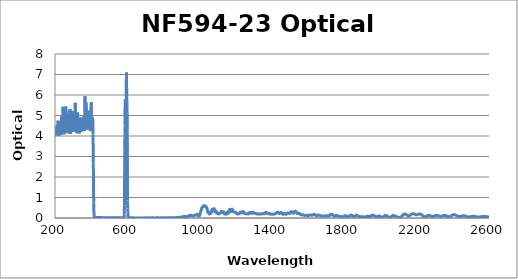
| Category | Optical Density |
|---|---|
| 2600.0 | 0.053 |
| 2599.0 | 0.053 |
| 2598.0 | 0.053 |
| 2597.0 | 0.053 |
| 2596.0 | 0.054 |
| 2595.0 | 0.054 |
| 2594.0 | 0.055 |
| 2593.0 | 0.055 |
| 2592.0 | 0.056 |
| 2591.0 | 0.057 |
| 2590.0 | 0.058 |
| 2589.0 | 0.058 |
| 2588.0 | 0.059 |
| 2587.0 | 0.06 |
| 2586.0 | 0.062 |
| 2585.0 | 0.063 |
| 2584.0 | 0.064 |
| 2583.0 | 0.065 |
| 2582.0 | 0.066 |
| 2581.0 | 0.067 |
| 2580.0 | 0.068 |
| 2579.0 | 0.069 |
| 2578.0 | 0.069 |
| 2577.0 | 0.07 |
| 2576.0 | 0.071 |
| 2575.0 | 0.072 |
| 2574.0 | 0.072 |
| 2573.0 | 0.073 |
| 2572.0 | 0.073 |
| 2571.0 | 0.073 |
| 2570.0 | 0.073 |
| 2569.0 | 0.073 |
| 2568.0 | 0.073 |
| 2567.0 | 0.072 |
| 2566.0 | 0.072 |
| 2565.0 | 0.071 |
| 2564.0 | 0.07 |
| 2563.0 | 0.069 |
| 2562.0 | 0.068 |
| 2561.0 | 0.067 |
| 2560.0 | 0.066 |
| 2559.0 | 0.064 |
| 2558.0 | 0.063 |
| 2557.0 | 0.062 |
| 2556.0 | 0.061 |
| 2555.0 | 0.059 |
| 2554.0 | 0.058 |
| 2553.0 | 0.056 |
| 2552.0 | 0.055 |
| 2551.0 | 0.053 |
| 2550.0 | 0.052 |
| 2549.0 | 0.05 |
| 2548.0 | 0.049 |
| 2547.0 | 0.048 |
| 2546.0 | 0.047 |
| 2545.0 | 0.046 |
| 2544.0 | 0.045 |
| 2543.0 | 0.045 |
| 2542.0 | 0.045 |
| 2541.0 | 0.045 |
| 2540.0 | 0.045 |
| 2539.0 | 0.046 |
| 2538.0 | 0.046 |
| 2537.0 | 0.047 |
| 2536.0 | 0.048 |
| 2535.0 | 0.05 |
| 2534.0 | 0.051 |
| 2533.0 | 0.053 |
| 2532.0 | 0.055 |
| 2531.0 | 0.056 |
| 2530.0 | 0.059 |
| 2529.0 | 0.061 |
| 2528.0 | 0.062 |
| 2527.0 | 0.064 |
| 2526.0 | 0.066 |
| 2525.0 | 0.069 |
| 2524.0 | 0.071 |
| 2523.0 | 0.073 |
| 2522.0 | 0.074 |
| 2521.0 | 0.076 |
| 2520.0 | 0.078 |
| 2519.0 | 0.08 |
| 2518.0 | 0.081 |
| 2517.0 | 0.082 |
| 2516.0 | 0.083 |
| 2515.0 | 0.084 |
| 2514.0 | 0.085 |
| 2513.0 | 0.085 |
| 2512.0 | 0.085 |
| 2511.0 | 0.085 |
| 2510.0 | 0.084 |
| 2509.0 | 0.084 |
| 2508.0 | 0.083 |
| 2507.0 | 0.082 |
| 2506.0 | 0.081 |
| 2505.0 | 0.079 |
| 2504.0 | 0.077 |
| 2503.0 | 0.075 |
| 2502.0 | 0.074 |
| 2501.0 | 0.072 |
| 2500.0 | 0.07 |
| 2499.0 | 0.068 |
| 2498.0 | 0.066 |
| 2497.0 | 0.064 |
| 2496.0 | 0.062 |
| 2495.0 | 0.06 |
| 2494.0 | 0.058 |
| 2493.0 | 0.057 |
| 2492.0 | 0.056 |
| 2491.0 | 0.055 |
| 2490.0 | 0.054 |
| 2489.0 | 0.053 |
| 2488.0 | 0.053 |
| 2487.0 | 0.053 |
| 2486.0 | 0.054 |
| 2485.0 | 0.055 |
| 2484.0 | 0.055 |
| 2483.0 | 0.057 |
| 2482.0 | 0.058 |
| 2481.0 | 0.06 |
| 2480.0 | 0.062 |
| 2479.0 | 0.065 |
| 2478.0 | 0.067 |
| 2477.0 | 0.07 |
| 2476.0 | 0.073 |
| 2475.0 | 0.076 |
| 2474.0 | 0.08 |
| 2473.0 | 0.083 |
| 2472.0 | 0.086 |
| 2471.0 | 0.09 |
| 2470.0 | 0.093 |
| 2469.0 | 0.096 |
| 2468.0 | 0.099 |
| 2467.0 | 0.101 |
| 2466.0 | 0.103 |
| 2465.0 | 0.105 |
| 2464.0 | 0.107 |
| 2463.0 | 0.109 |
| 2462.0 | 0.11 |
| 2461.0 | 0.111 |
| 2460.0 | 0.112 |
| 2459.0 | 0.112 |
| 2458.0 | 0.111 |
| 2457.0 | 0.111 |
| 2456.0 | 0.11 |
| 2455.0 | 0.109 |
| 2454.0 | 0.107 |
| 2453.0 | 0.106 |
| 2452.0 | 0.104 |
| 2451.0 | 0.101 |
| 2450.0 | 0.099 |
| 2449.0 | 0.096 |
| 2448.0 | 0.093 |
| 2447.0 | 0.091 |
| 2446.0 | 0.088 |
| 2445.0 | 0.085 |
| 2444.0 | 0.082 |
| 2443.0 | 0.08 |
| 2442.0 | 0.077 |
| 2441.0 | 0.075 |
| 2440.0 | 0.073 |
| 2439.0 | 0.072 |
| 2438.0 | 0.07 |
| 2437.0 | 0.07 |
| 2436.0 | 0.069 |
| 2435.0 | 0.07 |
| 2434.0 | 0.07 |
| 2433.0 | 0.071 |
| 2432.0 | 0.073 |
| 2431.0 | 0.075 |
| 2430.0 | 0.078 |
| 2429.0 | 0.081 |
| 2428.0 | 0.084 |
| 2427.0 | 0.088 |
| 2426.0 | 0.092 |
| 2425.0 | 0.097 |
| 2424.0 | 0.101 |
| 2423.0 | 0.106 |
| 2422.0 | 0.111 |
| 2421.0 | 0.116 |
| 2420.0 | 0.121 |
| 2419.0 | 0.126 |
| 2418.0 | 0.131 |
| 2417.0 | 0.136 |
| 2416.0 | 0.14 |
| 2415.0 | 0.144 |
| 2414.0 | 0.148 |
| 2413.0 | 0.151 |
| 2412.0 | 0.154 |
| 2411.0 | 0.156 |
| 2410.0 | 0.158 |
| 2409.0 | 0.159 |
| 2408.0 | 0.16 |
| 2407.0 | 0.16 |
| 2406.0 | 0.16 |
| 2405.0 | 0.16 |
| 2404.0 | 0.158 |
| 2403.0 | 0.157 |
| 2402.0 | 0.154 |
| 2401.0 | 0.151 |
| 2400.0 | 0.148 |
| 2399.0 | 0.144 |
| 2398.0 | 0.139 |
| 2397.0 | 0.135 |
| 2396.0 | 0.13 |
| 2395.0 | 0.124 |
| 2394.0 | 0.118 |
| 2393.0 | 0.112 |
| 2392.0 | 0.107 |
| 2391.0 | 0.101 |
| 2390.0 | 0.095 |
| 2389.0 | 0.09 |
| 2388.0 | 0.084 |
| 2387.0 | 0.079 |
| 2386.0 | 0.074 |
| 2385.0 | 0.07 |
| 2384.0 | 0.066 |
| 2383.0 | 0.063 |
| 2382.0 | 0.06 |
| 2381.0 | 0.058 |
| 2380.0 | 0.057 |
| 2379.0 | 0.057 |
| 2378.0 | 0.057 |
| 2377.0 | 0.058 |
| 2376.0 | 0.059 |
| 2375.0 | 0.061 |
| 2374.0 | 0.063 |
| 2373.0 | 0.067 |
| 2372.0 | 0.07 |
| 2371.0 | 0.074 |
| 2370.0 | 0.078 |
| 2369.0 | 0.082 |
| 2368.0 | 0.086 |
| 2367.0 | 0.091 |
| 2366.0 | 0.095 |
| 2365.0 | 0.099 |
| 2364.0 | 0.104 |
| 2363.0 | 0.108 |
| 2362.0 | 0.112 |
| 2361.0 | 0.115 |
| 2360.0 | 0.118 |
| 2359.0 | 0.121 |
| 2358.0 | 0.123 |
| 2357.0 | 0.125 |
| 2356.0 | 0.127 |
| 2355.0 | 0.128 |
| 2354.0 | 0.128 |
| 2353.0 | 0.128 |
| 2352.0 | 0.127 |
| 2351.0 | 0.126 |
| 2350.0 | 0.125 |
| 2349.0 | 0.123 |
| 2348.0 | 0.121 |
| 2347.0 | 0.118 |
| 2346.0 | 0.115 |
| 2345.0 | 0.112 |
| 2344.0 | 0.109 |
| 2343.0 | 0.106 |
| 2342.0 | 0.102 |
| 2341.0 | 0.099 |
| 2340.0 | 0.096 |
| 2339.0 | 0.093 |
| 2338.0 | 0.091 |
| 2337.0 | 0.088 |
| 2336.0 | 0.086 |
| 2335.0 | 0.085 |
| 2334.0 | 0.084 |
| 2333.0 | 0.083 |
| 2332.0 | 0.083 |
| 2331.0 | 0.083 |
| 2330.0 | 0.084 |
| 2329.0 | 0.085 |
| 2328.0 | 0.086 |
| 2327.0 | 0.088 |
| 2326.0 | 0.091 |
| 2325.0 | 0.093 |
| 2324.0 | 0.096 |
| 2323.0 | 0.099 |
| 2322.0 | 0.102 |
| 2321.0 | 0.106 |
| 2320.0 | 0.109 |
| 2319.0 | 0.112 |
| 2318.0 | 0.115 |
| 2317.0 | 0.118 |
| 2316.0 | 0.121 |
| 2315.0 | 0.123 |
| 2314.0 | 0.125 |
| 2313.0 | 0.126 |
| 2312.0 | 0.127 |
| 2311.0 | 0.128 |
| 2310.0 | 0.128 |
| 2309.0 | 0.128 |
| 2308.0 | 0.127 |
| 2307.0 | 0.125 |
| 2306.0 | 0.123 |
| 2305.0 | 0.121 |
| 2304.0 | 0.118 |
| 2303.0 | 0.115 |
| 2302.0 | 0.112 |
| 2301.0 | 0.108 |
| 2300.0 | 0.104 |
| 2299.0 | 0.101 |
| 2298.0 | 0.097 |
| 2297.0 | 0.092 |
| 2296.0 | 0.089 |
| 2295.0 | 0.085 |
| 2294.0 | 0.082 |
| 2293.0 | 0.079 |
| 2292.0 | 0.076 |
| 2291.0 | 0.074 |
| 2290.0 | 0.072 |
| 2289.0 | 0.071 |
| 2288.0 | 0.07 |
| 2287.0 | 0.07 |
| 2286.0 | 0.071 |
| 2285.0 | 0.072 |
| 2284.0 | 0.073 |
| 2283.0 | 0.076 |
| 2282.0 | 0.078 |
| 2281.0 | 0.082 |
| 2280.0 | 0.085 |
| 2279.0 | 0.089 |
| 2278.0 | 0.093 |
| 2277.0 | 0.097 |
| 2276.0 | 0.101 |
| 2275.0 | 0.105 |
| 2274.0 | 0.109 |
| 2273.0 | 0.113 |
| 2272.0 | 0.117 |
| 2271.0 | 0.12 |
| 2270.0 | 0.123 |
| 2269.0 | 0.125 |
| 2268.0 | 0.126 |
| 2267.0 | 0.127 |
| 2266.0 | 0.127 |
| 2265.0 | 0.127 |
| 2264.0 | 0.126 |
| 2263.0 | 0.124 |
| 2262.0 | 0.122 |
| 2261.0 | 0.119 |
| 2260.0 | 0.115 |
| 2259.0 | 0.112 |
| 2258.0 | 0.107 |
| 2257.0 | 0.102 |
| 2256.0 | 0.097 |
| 2255.0 | 0.092 |
| 2254.0 | 0.087 |
| 2253.0 | 0.083 |
| 2252.0 | 0.078 |
| 2251.0 | 0.073 |
| 2250.0 | 0.069 |
| 2249.0 | 0.065 |
| 2248.0 | 0.062 |
| 2247.0 | 0.059 |
| 2246.0 | 0.057 |
| 2245.0 | 0.056 |
| 2244.0 | 0.056 |
| 2243.0 | 0.057 |
| 2242.0 | 0.059 |
| 2241.0 | 0.062 |
| 2240.0 | 0.066 |
| 2239.0 | 0.071 |
| 2238.0 | 0.077 |
| 2237.0 | 0.083 |
| 2236.0 | 0.09 |
| 2235.0 | 0.098 |
| 2234.0 | 0.106 |
| 2233.0 | 0.114 |
| 2232.0 | 0.123 |
| 2231.0 | 0.131 |
| 2230.0 | 0.14 |
| 2229.0 | 0.147 |
| 2228.0 | 0.155 |
| 2227.0 | 0.162 |
| 2226.0 | 0.169 |
| 2225.0 | 0.175 |
| 2224.0 | 0.181 |
| 2223.0 | 0.186 |
| 2222.0 | 0.19 |
| 2221.0 | 0.193 |
| 2220.0 | 0.196 |
| 2219.0 | 0.197 |
| 2218.0 | 0.198 |
| 2217.0 | 0.199 |
| 2216.0 | 0.198 |
| 2215.0 | 0.197 |
| 2214.0 | 0.195 |
| 2213.0 | 0.194 |
| 2212.0 | 0.191 |
| 2211.0 | 0.189 |
| 2210.0 | 0.185 |
| 2209.0 | 0.182 |
| 2208.0 | 0.179 |
| 2207.0 | 0.175 |
| 2206.0 | 0.172 |
| 2205.0 | 0.169 |
| 2204.0 | 0.166 |
| 2203.0 | 0.163 |
| 2202.0 | 0.161 |
| 2201.0 | 0.16 |
| 2200.0 | 0.159 |
| 2199.0 | 0.159 |
| 2198.0 | 0.159 |
| 2197.0 | 0.16 |
| 2196.0 | 0.162 |
| 2195.0 | 0.164 |
| 2194.0 | 0.166 |
| 2193.0 | 0.17 |
| 2192.0 | 0.174 |
| 2191.0 | 0.177 |
| 2190.0 | 0.181 |
| 2189.0 | 0.186 |
| 2188.0 | 0.19 |
| 2187.0 | 0.194 |
| 2186.0 | 0.197 |
| 2185.0 | 0.201 |
| 2184.0 | 0.204 |
| 2183.0 | 0.206 |
| 2182.0 | 0.208 |
| 2181.0 | 0.209 |
| 2180.0 | 0.21 |
| 2179.0 | 0.21 |
| 2178.0 | 0.209 |
| 2177.0 | 0.207 |
| 2176.0 | 0.205 |
| 2175.0 | 0.202 |
| 2174.0 | 0.198 |
| 2173.0 | 0.193 |
| 2172.0 | 0.188 |
| 2171.0 | 0.182 |
| 2170.0 | 0.176 |
| 2169.0 | 0.17 |
| 2168.0 | 0.162 |
| 2167.0 | 0.155 |
| 2166.0 | 0.148 |
| 2165.0 | 0.141 |
| 2164.0 | 0.134 |
| 2163.0 | 0.127 |
| 2162.0 | 0.121 |
| 2161.0 | 0.115 |
| 2160.0 | 0.11 |
| 2159.0 | 0.106 |
| 2158.0 | 0.103 |
| 2157.0 | 0.101 |
| 2156.0 | 0.1 |
| 2155.0 | 0.1 |
| 2154.0 | 0.102 |
| 2153.0 | 0.104 |
| 2152.0 | 0.108 |
| 2151.0 | 0.112 |
| 2150.0 | 0.117 |
| 2149.0 | 0.123 |
| 2148.0 | 0.129 |
| 2147.0 | 0.136 |
| 2146.0 | 0.143 |
| 2145.0 | 0.15 |
| 2144.0 | 0.156 |
| 2143.0 | 0.163 |
| 2142.0 | 0.169 |
| 2141.0 | 0.174 |
| 2140.0 | 0.179 |
| 2139.0 | 0.183 |
| 2138.0 | 0.186 |
| 2137.0 | 0.189 |
| 2136.0 | 0.19 |
| 2135.0 | 0.191 |
| 2134.0 | 0.191 |
| 2133.0 | 0.19 |
| 2132.0 | 0.188 |
| 2131.0 | 0.185 |
| 2130.0 | 0.182 |
| 2129.0 | 0.177 |
| 2128.0 | 0.172 |
| 2127.0 | 0.166 |
| 2126.0 | 0.159 |
| 2125.0 | 0.152 |
| 2124.0 | 0.144 |
| 2123.0 | 0.136 |
| 2122.0 | 0.127 |
| 2121.0 | 0.118 |
| 2120.0 | 0.109 |
| 2119.0 | 0.1 |
| 2118.0 | 0.09 |
| 2117.0 | 0.081 |
| 2116.0 | 0.073 |
| 2115.0 | 0.064 |
| 2114.0 | 0.056 |
| 2113.0 | 0.049 |
| 2112.0 | 0.043 |
| 2111.0 | 0.037 |
| 2110.0 | 0.032 |
| 2109.0 | 0.028 |
| 2108.0 | 0.025 |
| 2107.0 | 0.022 |
| 2106.0 | 0.021 |
| 2105.0 | 0.02 |
| 2104.0 | 0.019 |
| 2103.0 | 0.019 |
| 2102.0 | 0.02 |
| 2101.0 | 0.021 |
| 2100.0 | 0.023 |
| 2099.0 | 0.025 |
| 2098.0 | 0.028 |
| 2097.0 | 0.03 |
| 2096.0 | 0.033 |
| 2095.0 | 0.037 |
| 2094.0 | 0.04 |
| 2093.0 | 0.044 |
| 2092.0 | 0.047 |
| 2091.0 | 0.051 |
| 2090.0 | 0.055 |
| 2089.0 | 0.059 |
| 2088.0 | 0.064 |
| 2087.0 | 0.068 |
| 2086.0 | 0.072 |
| 2085.0 | 0.077 |
| 2084.0 | 0.081 |
| 2083.0 | 0.086 |
| 2082.0 | 0.09 |
| 2081.0 | 0.094 |
| 2080.0 | 0.099 |
| 2079.0 | 0.102 |
| 2078.0 | 0.106 |
| 2077.0 | 0.11 |
| 2076.0 | 0.112 |
| 2075.0 | 0.115 |
| 2074.0 | 0.117 |
| 2073.0 | 0.118 |
| 2072.0 | 0.119 |
| 2071.0 | 0.119 |
| 2070.0 | 0.118 |
| 2069.0 | 0.116 |
| 2068.0 | 0.114 |
| 2067.0 | 0.111 |
| 2066.0 | 0.108 |
| 2065.0 | 0.103 |
| 2064.0 | 0.098 |
| 2063.0 | 0.093 |
| 2062.0 | 0.087 |
| 2061.0 | 0.08 |
| 2060.0 | 0.074 |
| 2059.0 | 0.067 |
| 2058.0 | 0.06 |
| 2057.0 | 0.054 |
| 2056.0 | 0.047 |
| 2055.0 | 0.041 |
| 2054.0 | 0.036 |
| 2053.0 | 0.032 |
| 2052.0 | 0.029 |
| 2051.0 | 0.026 |
| 2050.0 | 0.025 |
| 2049.0 | 0.025 |
| 2048.0 | 0.026 |
| 2047.0 | 0.029 |
| 2046.0 | 0.032 |
| 2045.0 | 0.037 |
| 2044.0 | 0.043 |
| 2043.0 | 0.049 |
| 2042.0 | 0.057 |
| 2041.0 | 0.065 |
| 2040.0 | 0.073 |
| 2039.0 | 0.081 |
| 2038.0 | 0.089 |
| 2037.0 | 0.097 |
| 2036.0 | 0.105 |
| 2035.0 | 0.111 |
| 2034.0 | 0.117 |
| 2033.0 | 0.122 |
| 2032.0 | 0.126 |
| 2031.0 | 0.129 |
| 2030.0 | 0.131 |
| 2029.0 | 0.131 |
| 2028.0 | 0.131 |
| 2027.0 | 0.129 |
| 2026.0 | 0.126 |
| 2025.0 | 0.121 |
| 2024.0 | 0.116 |
| 2023.0 | 0.11 |
| 2022.0 | 0.103 |
| 2021.0 | 0.095 |
| 2020.0 | 0.088 |
| 2019.0 | 0.079 |
| 2018.0 | 0.071 |
| 2017.0 | 0.063 |
| 2016.0 | 0.056 |
| 2015.0 | 0.049 |
| 2014.0 | 0.042 |
| 2013.0 | 0.037 |
| 2012.0 | 0.033 |
| 2011.0 | 0.03 |
| 2010.0 | 0.029 |
| 2009.0 | 0.028 |
| 2008.0 | 0.029 |
| 2007.0 | 0.032 |
| 2006.0 | 0.035 |
| 2005.0 | 0.04 |
| 2004.0 | 0.045 |
| 2003.0 | 0.051 |
| 2002.0 | 0.058 |
| 2001.0 | 0.065 |
| 2000.0 | 0.071 |
| 1999.0 | 0.078 |
| 1998.0 | 0.084 |
| 1997.0 | 0.089 |
| 1996.0 | 0.094 |
| 1995.0 | 0.098 |
| 1994.0 | 0.101 |
| 1993.0 | 0.103 |
| 1992.0 | 0.103 |
| 1991.0 | 0.103 |
| 1990.0 | 0.102 |
| 1989.0 | 0.1 |
| 1988.0 | 0.097 |
| 1987.0 | 0.093 |
| 1986.0 | 0.088 |
| 1985.0 | 0.083 |
| 1984.0 | 0.078 |
| 1983.0 | 0.073 |
| 1982.0 | 0.068 |
| 1981.0 | 0.064 |
| 1980.0 | 0.06 |
| 1979.0 | 0.057 |
| 1978.0 | 0.055 |
| 1977.0 | 0.053 |
| 1976.0 | 0.053 |
| 1975.0 | 0.054 |
| 1974.0 | 0.056 |
| 1973.0 | 0.059 |
| 1972.0 | 0.064 |
| 1971.0 | 0.069 |
| 1970.0 | 0.075 |
| 1969.0 | 0.081 |
| 1968.0 | 0.087 |
| 1967.0 | 0.095 |
| 1966.0 | 0.102 |
| 1965.0 | 0.109 |
| 1964.0 | 0.115 |
| 1963.0 | 0.121 |
| 1962.0 | 0.127 |
| 1961.0 | 0.131 |
| 1960.0 | 0.135 |
| 1959.0 | 0.138 |
| 1958.0 | 0.139 |
| 1957.0 | 0.14 |
| 1956.0 | 0.14 |
| 1955.0 | 0.139 |
| 1954.0 | 0.136 |
| 1953.0 | 0.133 |
| 1952.0 | 0.129 |
| 1951.0 | 0.125 |
| 1950.0 | 0.12 |
| 1949.0 | 0.114 |
| 1948.0 | 0.109 |
| 1947.0 | 0.104 |
| 1946.0 | 0.099 |
| 1945.0 | 0.094 |
| 1944.0 | 0.089 |
| 1943.0 | 0.085 |
| 1942.0 | 0.082 |
| 1941.0 | 0.079 |
| 1940.0 | 0.077 |
| 1939.0 | 0.076 |
| 1938.0 | 0.076 |
| 1937.0 | 0.076 |
| 1936.0 | 0.076 |
| 1935.0 | 0.077 |
| 1934.0 | 0.078 |
| 1933.0 | 0.079 |
| 1932.0 | 0.08 |
| 1931.0 | 0.081 |
| 1930.0 | 0.082 |
| 1929.0 | 0.082 |
| 1928.0 | 0.082 |
| 1927.0 | 0.082 |
| 1926.0 | 0.081 |
| 1925.0 | 0.08 |
| 1924.0 | 0.078 |
| 1923.0 | 0.076 |
| 1922.0 | 0.073 |
| 1921.0 | 0.07 |
| 1920.0 | 0.067 |
| 1919.0 | 0.063 |
| 1918.0 | 0.06 |
| 1917.0 | 0.057 |
| 1916.0 | 0.055 |
| 1915.0 | 0.053 |
| 1914.0 | 0.05 |
| 1913.0 | 0.049 |
| 1912.0 | 0.048 |
| 1911.0 | 0.048 |
| 1910.0 | 0.048 |
| 1909.0 | 0.049 |
| 1908.0 | 0.05 |
| 1907.0 | 0.052 |
| 1906.0 | 0.054 |
| 1905.0 | 0.057 |
| 1904.0 | 0.059 |
| 1903.0 | 0.061 |
| 1902.0 | 0.063 |
| 1901.0 | 0.064 |
| 1900.0 | 0.066 |
| 1899.0 | 0.067 |
| 1898.0 | 0.067 |
| 1897.0 | 0.067 |
| 1896.0 | 0.066 |
| 1895.0 | 0.065 |
| 1894.0 | 0.064 |
| 1893.0 | 0.062 |
| 1892.0 | 0.061 |
| 1891.0 | 0.059 |
| 1890.0 | 0.057 |
| 1889.0 | 0.056 |
| 1888.0 | 0.055 |
| 1887.0 | 0.054 |
| 1886.0 | 0.054 |
| 1885.0 | 0.055 |
| 1884.0 | 0.057 |
| 1883.0 | 0.06 |
| 1882.0 | 0.063 |
| 1881.0 | 0.068 |
| 1880.0 | 0.073 |
| 1879.0 | 0.078 |
| 1878.0 | 0.084 |
| 1877.0 | 0.091 |
| 1876.0 | 0.097 |
| 1875.0 | 0.104 |
| 1874.0 | 0.11 |
| 1873.0 | 0.116 |
| 1872.0 | 0.121 |
| 1871.0 | 0.126 |
| 1870.0 | 0.129 |
| 1869.0 | 0.131 |
| 1868.0 | 0.132 |
| 1867.0 | 0.131 |
| 1866.0 | 0.129 |
| 1865.0 | 0.126 |
| 1864.0 | 0.123 |
| 1863.0 | 0.118 |
| 1862.0 | 0.113 |
| 1861.0 | 0.107 |
| 1860.0 | 0.101 |
| 1859.0 | 0.095 |
| 1858.0 | 0.089 |
| 1857.0 | 0.085 |
| 1856.0 | 0.08 |
| 1855.0 | 0.076 |
| 1854.0 | 0.074 |
| 1853.0 | 0.073 |
| 1852.0 | 0.073 |
| 1851.0 | 0.074 |
| 1850.0 | 0.076 |
| 1849.0 | 0.08 |
| 1848.0 | 0.087 |
| 1847.0 | 0.094 |
| 1846.0 | 0.101 |
| 1845.0 | 0.108 |
| 1844.0 | 0.113 |
| 1843.0 | 0.119 |
| 1842.0 | 0.125 |
| 1841.0 | 0.131 |
| 1840.0 | 0.137 |
| 1839.0 | 0.141 |
| 1838.0 | 0.143 |
| 1837.0 | 0.144 |
| 1836.0 | 0.143 |
| 1835.0 | 0.141 |
| 1834.0 | 0.138 |
| 1833.0 | 0.133 |
| 1832.0 | 0.127 |
| 1831.0 | 0.121 |
| 1830.0 | 0.113 |
| 1829.0 | 0.105 |
| 1828.0 | 0.097 |
| 1827.0 | 0.089 |
| 1826.0 | 0.081 |
| 1825.0 | 0.074 |
| 1824.0 | 0.069 |
| 1823.0 | 0.064 |
| 1822.0 | 0.062 |
| 1821.0 | 0.06 |
| 1820.0 | 0.06 |
| 1819.0 | 0.062 |
| 1818.0 | 0.064 |
| 1817.0 | 0.068 |
| 1816.0 | 0.072 |
| 1815.0 | 0.077 |
| 1814.0 | 0.083 |
| 1813.0 | 0.088 |
| 1812.0 | 0.094 |
| 1811.0 | 0.099 |
| 1810.0 | 0.104 |
| 1809.0 | 0.108 |
| 1808.0 | 0.111 |
| 1807.0 | 0.112 |
| 1806.0 | 0.113 |
| 1805.0 | 0.112 |
| 1804.0 | 0.111 |
| 1803.0 | 0.109 |
| 1802.0 | 0.106 |
| 1801.0 | 0.102 |
| 1800.0 | 0.097 |
| 1799.0 | 0.092 |
| 1798.0 | 0.088 |
| 1797.0 | 0.082 |
| 1796.0 | 0.077 |
| 1795.0 | 0.073 |
| 1794.0 | 0.07 |
| 1793.0 | 0.067 |
| 1792.0 | 0.065 |
| 1791.0 | 0.063 |
| 1790.0 | 0.062 |
| 1789.0 | 0.062 |
| 1788.0 | 0.063 |
| 1787.0 | 0.064 |
| 1786.0 | 0.065 |
| 1785.0 | 0.067 |
| 1784.0 | 0.068 |
| 1783.0 | 0.07 |
| 1782.0 | 0.071 |
| 1781.0 | 0.072 |
| 1780.0 | 0.073 |
| 1779.0 | 0.073 |
| 1778.0 | 0.074 |
| 1777.0 | 0.074 |
| 1776.0 | 0.074 |
| 1775.0 | 0.075 |
| 1774.0 | 0.075 |
| 1773.0 | 0.076 |
| 1772.0 | 0.078 |
| 1771.0 | 0.079 |
| 1770.0 | 0.082 |
| 1769.0 | 0.085 |
| 1768.0 | 0.088 |
| 1767.0 | 0.092 |
| 1766.0 | 0.096 |
| 1765.0 | 0.1 |
| 1764.0 | 0.105 |
| 1763.0 | 0.109 |
| 1762.0 | 0.113 |
| 1761.0 | 0.117 |
| 1760.0 | 0.12 |
| 1759.0 | 0.122 |
| 1758.0 | 0.124 |
| 1757.0 | 0.124 |
| 1756.0 | 0.123 |
| 1755.0 | 0.122 |
| 1754.0 | 0.12 |
| 1753.0 | 0.117 |
| 1752.0 | 0.113 |
| 1751.0 | 0.109 |
| 1750.0 | 0.105 |
| 1749.0 | 0.101 |
| 1748.0 | 0.098 |
| 1747.0 | 0.096 |
| 1746.0 | 0.095 |
| 1745.0 | 0.095 |
| 1744.0 | 0.097 |
| 1743.0 | 0.1 |
| 1742.0 | 0.105 |
| 1741.0 | 0.111 |
| 1740.0 | 0.117 |
| 1739.0 | 0.126 |
| 1738.0 | 0.134 |
| 1737.0 | 0.143 |
| 1736.0 | 0.152 |
| 1735.0 | 0.16 |
| 1734.0 | 0.167 |
| 1733.0 | 0.174 |
| 1732.0 | 0.18 |
| 1731.0 | 0.184 |
| 1730.0 | 0.187 |
| 1729.0 | 0.188 |
| 1728.0 | 0.187 |
| 1727.0 | 0.185 |
| 1726.0 | 0.181 |
| 1725.0 | 0.176 |
| 1724.0 | 0.17 |
| 1723.0 | 0.162 |
| 1722.0 | 0.154 |
| 1721.0 | 0.145 |
| 1720.0 | 0.136 |
| 1719.0 | 0.127 |
| 1718.0 | 0.119 |
| 1717.0 | 0.112 |
| 1716.0 | 0.105 |
| 1715.0 | 0.101 |
| 1714.0 | 0.097 |
| 1713.0 | 0.095 |
| 1712.0 | 0.095 |
| 1711.0 | 0.095 |
| 1710.0 | 0.097 |
| 1709.0 | 0.099 |
| 1708.0 | 0.102 |
| 1707.0 | 0.105 |
| 1706.0 | 0.108 |
| 1705.0 | 0.11 |
| 1704.0 | 0.112 |
| 1703.0 | 0.113 |
| 1702.0 | 0.114 |
| 1701.0 | 0.113 |
| 1700.0 | 0.112 |
| 1699.0 | 0.11 |
| 1698.0 | 0.108 |
| 1697.0 | 0.105 |
| 1696.0 | 0.103 |
| 1695.0 | 0.1 |
| 1694.0 | 0.098 |
| 1693.0 | 0.095 |
| 1692.0 | 0.094 |
| 1691.0 | 0.093 |
| 1690.0 | 0.092 |
| 1689.0 | 0.092 |
| 1688.0 | 0.092 |
| 1687.0 | 0.093 |
| 1686.0 | 0.094 |
| 1685.0 | 0.096 |
| 1684.0 | 0.097 |
| 1683.0 | 0.098 |
| 1682.0 | 0.099 |
| 1681.0 | 0.099 |
| 1680.0 | 0.099 |
| 1679.0 | 0.099 |
| 1678.0 | 0.098 |
| 1677.0 | 0.098 |
| 1676.0 | 0.097 |
| 1675.0 | 0.096 |
| 1674.0 | 0.096 |
| 1673.0 | 0.097 |
| 1672.0 | 0.098 |
| 1671.0 | 0.1 |
| 1670.0 | 0.103 |
| 1669.0 | 0.107 |
| 1668.0 | 0.112 |
| 1667.0 | 0.117 |
| 1666.0 | 0.123 |
| 1665.0 | 0.128 |
| 1664.0 | 0.134 |
| 1663.0 | 0.14 |
| 1662.0 | 0.144 |
| 1661.0 | 0.148 |
| 1660.0 | 0.15 |
| 1659.0 | 0.152 |
| 1658.0 | 0.152 |
| 1657.0 | 0.15 |
| 1656.0 | 0.148 |
| 1655.0 | 0.144 |
| 1654.0 | 0.139 |
| 1653.0 | 0.134 |
| 1652.0 | 0.128 |
| 1651.0 | 0.122 |
| 1650.0 | 0.117 |
| 1649.0 | 0.112 |
| 1648.0 | 0.109 |
| 1647.0 | 0.107 |
| 1646.0 | 0.107 |
| 1645.0 | 0.108 |
| 1644.0 | 0.112 |
| 1643.0 | 0.117 |
| 1642.0 | 0.123 |
| 1641.0 | 0.13 |
| 1640.0 | 0.139 |
| 1639.0 | 0.147 |
| 1638.0 | 0.155 |
| 1637.0 | 0.163 |
| 1636.0 | 0.169 |
| 1635.0 | 0.174 |
| 1634.0 | 0.177 |
| 1633.0 | 0.179 |
| 1632.0 | 0.179 |
| 1631.0 | 0.177 |
| 1630.0 | 0.174 |
| 1629.0 | 0.17 |
| 1628.0 | 0.164 |
| 1627.0 | 0.159 |
| 1626.0 | 0.153 |
| 1625.0 | 0.148 |
| 1624.0 | 0.144 |
| 1623.0 | 0.14 |
| 1622.0 | 0.137 |
| 1621.0 | 0.136 |
| 1620.0 | 0.136 |
| 1619.0 | 0.136 |
| 1618.0 | 0.138 |
| 1617.0 | 0.141 |
| 1616.0 | 0.143 |
| 1615.0 | 0.146 |
| 1614.0 | 0.148 |
| 1613.0 | 0.15 |
| 1612.0 | 0.151 |
| 1611.0 | 0.151 |
| 1610.0 | 0.15 |
| 1609.0 | 0.148 |
| 1608.0 | 0.145 |
| 1607.0 | 0.142 |
| 1606.0 | 0.138 |
| 1605.0 | 0.134 |
| 1604.0 | 0.129 |
| 1603.0 | 0.126 |
| 1602.0 | 0.123 |
| 1601.0 | 0.121 |
| 1600.0 | 0.12 |
| 1599.0 | 0.12 |
| 1598.0 | 0.121 |
| 1597.0 | 0.123 |
| 1596.0 | 0.125 |
| 1595.0 | 0.128 |
| 1594.0 | 0.131 |
| 1593.0 | 0.133 |
| 1592.0 | 0.135 |
| 1591.0 | 0.137 |
| 1590.0 | 0.137 |
| 1589.0 | 0.136 |
| 1588.0 | 0.135 |
| 1587.0 | 0.133 |
| 1586.0 | 0.131 |
| 1585.0 | 0.129 |
| 1584.0 | 0.127 |
| 1583.0 | 0.126 |
| 1582.0 | 0.125 |
| 1581.0 | 0.126 |
| 1580.0 | 0.128 |
| 1579.0 | 0.13 |
| 1578.0 | 0.134 |
| 1577.0 | 0.138 |
| 1576.0 | 0.143 |
| 1575.0 | 0.148 |
| 1574.0 | 0.153 |
| 1573.0 | 0.157 |
| 1572.0 | 0.16 |
| 1571.0 | 0.162 |
| 1570.0 | 0.163 |
| 1569.0 | 0.162 |
| 1568.0 | 0.161 |
| 1567.0 | 0.159 |
| 1566.0 | 0.156 |
| 1565.0 | 0.153 |
| 1564.0 | 0.151 |
| 1563.0 | 0.149 |
| 1562.0 | 0.149 |
| 1561.0 | 0.151 |
| 1560.0 | 0.154 |
| 1559.0 | 0.16 |
| 1558.0 | 0.168 |
| 1557.0 | 0.176 |
| 1556.0 | 0.187 |
| 1555.0 | 0.196 |
| 1554.0 | 0.206 |
| 1553.0 | 0.214 |
| 1552.0 | 0.222 |
| 1551.0 | 0.227 |
| 1550.0 | 0.231 |
| 1549.0 | 0.232 |
| 1548.0 | 0.231 |
| 1547.0 | 0.229 |
| 1546.0 | 0.225 |
| 1545.0 | 0.221 |
| 1544.0 | 0.218 |
| 1543.0 | 0.215 |
| 1542.0 | 0.215 |
| 1541.0 | 0.216 |
| 1540.0 | 0.221 |
| 1539.0 | 0.229 |
| 1538.0 | 0.238 |
| 1537.0 | 0.25 |
| 1536.0 | 0.264 |
| 1535.0 | 0.278 |
| 1534.0 | 0.292 |
| 1533.0 | 0.306 |
| 1532.0 | 0.318 |
| 1531.0 | 0.327 |
| 1530.0 | 0.333 |
| 1529.0 | 0.336 |
| 1528.0 | 0.336 |
| 1527.0 | 0.332 |
| 1526.0 | 0.325 |
| 1525.0 | 0.315 |
| 1524.0 | 0.302 |
| 1523.0 | 0.288 |
| 1522.0 | 0.273 |
| 1521.0 | 0.259 |
| 1520.0 | 0.245 |
| 1519.0 | 0.236 |
| 1518.0 | 0.231 |
| 1517.0 | 0.23 |
| 1516.0 | 0.233 |
| 1515.0 | 0.241 |
| 1514.0 | 0.251 |
| 1513.0 | 0.263 |
| 1512.0 | 0.276 |
| 1511.0 | 0.288 |
| 1510.0 | 0.299 |
| 1509.0 | 0.306 |
| 1508.0 | 0.31 |
| 1507.0 | 0.311 |
| 1506.0 | 0.307 |
| 1505.0 | 0.301 |
| 1504.0 | 0.291 |
| 1503.0 | 0.279 |
| 1502.0 | 0.266 |
| 1501.0 | 0.252 |
| 1500.0 | 0.239 |
| 1499.0 | 0.228 |
| 1498.0 | 0.22 |
| 1497.0 | 0.215 |
| 1496.0 | 0.213 |
| 1495.0 | 0.214 |
| 1494.0 | 0.218 |
| 1493.0 | 0.225 |
| 1492.0 | 0.231 |
| 1491.0 | 0.238 |
| 1490.0 | 0.244 |
| 1489.0 | 0.249 |
| 1488.0 | 0.251 |
| 1487.0 | 0.25 |
| 1486.0 | 0.246 |
| 1485.0 | 0.24 |
| 1484.0 | 0.232 |
| 1483.0 | 0.222 |
| 1482.0 | 0.211 |
| 1481.0 | 0.201 |
| 1480.0 | 0.193 |
| 1479.0 | 0.186 |
| 1478.0 | 0.183 |
| 1477.0 | 0.184 |
| 1476.0 | 0.187 |
| 1475.0 | 0.193 |
| 1474.0 | 0.201 |
| 1473.0 | 0.208 |
| 1472.0 | 0.215 |
| 1471.0 | 0.221 |
| 1470.0 | 0.224 |
| 1469.0 | 0.224 |
| 1468.0 | 0.222 |
| 1467.0 | 0.216 |
| 1466.0 | 0.209 |
| 1465.0 | 0.2 |
| 1464.0 | 0.191 |
| 1463.0 | 0.184 |
| 1462.0 | 0.178 |
| 1461.0 | 0.176 |
| 1460.0 | 0.177 |
| 1459.0 | 0.182 |
| 1458.0 | 0.192 |
| 1457.0 | 0.202 |
| 1456.0 | 0.216 |
| 1455.0 | 0.23 |
| 1454.0 | 0.244 |
| 1453.0 | 0.256 |
| 1452.0 | 0.265 |
| 1451.0 | 0.271 |
| 1450.0 | 0.274 |
| 1449.0 | 0.274 |
| 1448.0 | 0.27 |
| 1447.0 | 0.264 |
| 1446.0 | 0.255 |
| 1445.0 | 0.245 |
| 1444.0 | 0.236 |
| 1443.0 | 0.228 |
| 1442.0 | 0.221 |
| 1441.0 | 0.219 |
| 1440.0 | 0.22 |
| 1439.0 | 0.225 |
| 1438.0 | 0.233 |
| 1437.0 | 0.243 |
| 1436.0 | 0.254 |
| 1435.0 | 0.264 |
| 1434.0 | 0.274 |
| 1433.0 | 0.28 |
| 1432.0 | 0.285 |
| 1431.0 | 0.286 |
| 1430.0 | 0.284 |
| 1429.0 | 0.28 |
| 1428.0 | 0.272 |
| 1427.0 | 0.263 |
| 1426.0 | 0.254 |
| 1425.0 | 0.244 |
| 1424.0 | 0.235 |
| 1423.0 | 0.228 |
| 1422.0 | 0.222 |
| 1421.0 | 0.218 |
| 1420.0 | 0.215 |
| 1419.0 | 0.214 |
| 1418.0 | 0.213 |
| 1417.0 | 0.213 |
| 1416.0 | 0.212 |
| 1415.0 | 0.209 |
| 1414.0 | 0.206 |
| 1413.0 | 0.203 |
| 1412.0 | 0.199 |
| 1411.0 | 0.193 |
| 1410.0 | 0.188 |
| 1409.0 | 0.184 |
| 1408.0 | 0.181 |
| 1407.0 | 0.179 |
| 1406.0 | 0.178 |
| 1405.0 | 0.179 |
| 1404.0 | 0.181 |
| 1403.0 | 0.184 |
| 1402.0 | 0.186 |
| 1401.0 | 0.188 |
| 1400.0 | 0.19 |
| 1399.0 | 0.191 |
| 1398.0 | 0.19 |
| 1397.0 | 0.189 |
| 1396.0 | 0.185 |
| 1395.0 | 0.183 |
| 1394.0 | 0.182 |
| 1393.0 | 0.181 |
| 1392.0 | 0.182 |
| 1391.0 | 0.185 |
| 1390.0 | 0.189 |
| 1389.0 | 0.195 |
| 1388.0 | 0.203 |
| 1387.0 | 0.211 |
| 1386.0 | 0.218 |
| 1385.0 | 0.223 |
| 1384.0 | 0.226 |
| 1383.0 | 0.227 |
| 1382.0 | 0.226 |
| 1381.0 | 0.224 |
| 1380.0 | 0.22 |
| 1379.0 | 0.215 |
| 1378.0 | 0.21 |
| 1377.0 | 0.207 |
| 1376.0 | 0.206 |
| 1375.0 | 0.208 |
| 1374.0 | 0.214 |
| 1373.0 | 0.221 |
| 1372.0 | 0.231 |
| 1371.0 | 0.242 |
| 1370.0 | 0.254 |
| 1369.0 | 0.264 |
| 1368.0 | 0.272 |
| 1367.0 | 0.278 |
| 1366.0 | 0.28 |
| 1365.0 | 0.278 |
| 1364.0 | 0.272 |
| 1363.0 | 0.265 |
| 1362.0 | 0.254 |
| 1361.0 | 0.242 |
| 1360.0 | 0.23 |
| 1359.0 | 0.221 |
| 1358.0 | 0.211 |
| 1357.0 | 0.206 |
| 1356.0 | 0.202 |
| 1355.0 | 0.202 |
| 1354.0 | 0.205 |
| 1353.0 | 0.208 |
| 1352.0 | 0.212 |
| 1351.0 | 0.215 |
| 1350.0 | 0.216 |
| 1349.0 | 0.216 |
| 1348.0 | 0.215 |
| 1347.0 | 0.212 |
| 1346.0 | 0.209 |
| 1345.0 | 0.204 |
| 1344.0 | 0.2 |
| 1343.0 | 0.197 |
| 1342.0 | 0.195 |
| 1341.0 | 0.194 |
| 1340.0 | 0.194 |
| 1339.0 | 0.195 |
| 1338.0 | 0.197 |
| 1337.0 | 0.198 |
| 1336.0 | 0.2 |
| 1335.0 | 0.2 |
| 1334.0 | 0.2 |
| 1333.0 | 0.199 |
| 1332.0 | 0.197 |
| 1331.0 | 0.196 |
| 1330.0 | 0.194 |
| 1329.0 | 0.193 |
| 1328.0 | 0.192 |
| 1327.0 | 0.192 |
| 1326.0 | 0.193 |
| 1325.0 | 0.194 |
| 1324.0 | 0.195 |
| 1323.0 | 0.195 |
| 1322.0 | 0.196 |
| 1321.0 | 0.196 |
| 1320.0 | 0.196 |
| 1319.0 | 0.196 |
| 1318.0 | 0.196 |
| 1317.0 | 0.198 |
| 1316.0 | 0.2 |
| 1315.0 | 0.204 |
| 1314.0 | 0.21 |
| 1313.0 | 0.216 |
| 1312.0 | 0.222 |
| 1311.0 | 0.228 |
| 1310.0 | 0.232 |
| 1309.0 | 0.235 |
| 1308.0 | 0.236 |
| 1307.0 | 0.236 |
| 1306.0 | 0.233 |
| 1305.0 | 0.23 |
| 1304.0 | 0.227 |
| 1303.0 | 0.226 |
| 1302.0 | 0.226 |
| 1301.0 | 0.229 |
| 1300.0 | 0.235 |
| 1299.0 | 0.243 |
| 1298.0 | 0.252 |
| 1297.0 | 0.262 |
| 1296.0 | 0.271 |
| 1295.0 | 0.277 |
| 1294.0 | 0.281 |
| 1293.0 | 0.281 |
| 1292.0 | 0.278 |
| 1291.0 | 0.271 |
| 1290.0 | 0.263 |
| 1289.0 | 0.253 |
| 1288.0 | 0.243 |
| 1287.0 | 0.235 |
| 1286.0 | 0.231 |
| 1285.0 | 0.23 |
| 1284.0 | 0.234 |
| 1283.0 | 0.241 |
| 1282.0 | 0.25 |
| 1281.0 | 0.259 |
| 1280.0 | 0.267 |
| 1279.0 | 0.272 |
| 1278.0 | 0.274 |
| 1277.0 | 0.271 |
| 1276.0 | 0.264 |
| 1275.0 | 0.255 |
| 1274.0 | 0.243 |
| 1273.0 | 0.231 |
| 1272.0 | 0.219 |
| 1271.0 | 0.209 |
| 1270.0 | 0.202 |
| 1269.0 | 0.199 |
| 1268.0 | 0.198 |
| 1267.0 | 0.199 |
| 1266.0 | 0.201 |
| 1265.0 | 0.203 |
| 1264.0 | 0.205 |
| 1263.0 | 0.206 |
| 1262.0 | 0.206 |
| 1261.0 | 0.206 |
| 1260.0 | 0.206 |
| 1259.0 | 0.206 |
| 1258.0 | 0.207 |
| 1257.0 | 0.208 |
| 1256.0 | 0.209 |
| 1255.0 | 0.21 |
| 1254.0 | 0.211 |
| 1253.0 | 0.211 |
| 1252.0 | 0.211 |
| 1251.0 | 0.211 |
| 1250.0 | 0.212 |
| 1249.0 | 0.215 |
| 1248.0 | 0.221 |
| 1247.0 | 0.23 |
| 1246.0 | 0.243 |
| 1245.0 | 0.258 |
| 1244.0 | 0.274 |
| 1243.0 | 0.29 |
| 1242.0 | 0.303 |
| 1241.0 | 0.313 |
| 1240.0 | 0.318 |
| 1239.0 | 0.316 |
| 1238.0 | 0.309 |
| 1237.0 | 0.298 |
| 1236.0 | 0.284 |
| 1235.0 | 0.269 |
| 1234.0 | 0.258 |
| 1233.0 | 0.251 |
| 1232.0 | 0.25 |
| 1231.0 | 0.254 |
| 1230.0 | 0.262 |
| 1229.0 | 0.272 |
| 1228.0 | 0.281 |
| 1227.0 | 0.288 |
| 1226.0 | 0.289 |
| 1225.0 | 0.286 |
| 1224.0 | 0.278 |
| 1223.0 | 0.265 |
| 1222.0 | 0.251 |
| 1221.0 | 0.236 |
| 1220.0 | 0.223 |
| 1219.0 | 0.212 |
| 1218.0 | 0.206 |
| 1217.0 | 0.203 |
| 1216.0 | 0.203 |
| 1215.0 | 0.204 |
| 1214.0 | 0.204 |
| 1213.0 | 0.204 |
| 1212.0 | 0.202 |
| 1211.0 | 0.199 |
| 1210.0 | 0.196 |
| 1209.0 | 0.195 |
| 1208.0 | 0.196 |
| 1207.0 | 0.202 |
| 1206.0 | 0.21 |
| 1205.0 | 0.222 |
| 1204.0 | 0.234 |
| 1203.0 | 0.246 |
| 1202.0 | 0.255 |
| 1201.0 | 0.262 |
| 1200.0 | 0.266 |
| 1199.0 | 0.268 |
| 1198.0 | 0.269 |
| 1197.0 | 0.271 |
| 1196.0 | 0.274 |
| 1195.0 | 0.279 |
| 1194.0 | 0.286 |
| 1193.0 | 0.292 |
| 1192.0 | 0.298 |
| 1191.0 | 0.301 |
| 1190.0 | 0.302 |
| 1189.0 | 0.301 |
| 1188.0 | 0.301 |
| 1187.0 | 0.303 |
| 1186.0 | 0.311 |
| 1185.0 | 0.324 |
| 1184.0 | 0.344 |
| 1183.0 | 0.367 |
| 1182.0 | 0.391 |
| 1181.0 | 0.412 |
| 1180.0 | 0.427 |
| 1179.0 | 0.433 |
| 1178.0 | 0.429 |
| 1177.0 | 0.414 |
| 1176.0 | 0.391 |
| 1175.0 | 0.364 |
| 1174.0 | 0.337 |
| 1173.0 | 0.316 |
| 1172.0 | 0.306 |
| 1171.0 | 0.312 |
| 1170.0 | 0.329 |
| 1169.0 | 0.355 |
| 1168.0 | 0.383 |
| 1167.0 | 0.405 |
| 1166.0 | 0.417 |
| 1165.0 | 0.416 |
| 1164.0 | 0.401 |
| 1163.0 | 0.372 |
| 1162.0 | 0.335 |
| 1161.0 | 0.293 |
| 1160.0 | 0.257 |
| 1159.0 | 0.235 |
| 1158.0 | 0.228 |
| 1157.0 | 0.237 |
| 1156.0 | 0.254 |
| 1155.0 | 0.274 |
| 1154.0 | 0.287 |
| 1153.0 | 0.289 |
| 1152.0 | 0.279 |
| 1151.0 | 0.258 |
| 1150.0 | 0.234 |
| 1149.0 | 0.21 |
| 1148.0 | 0.192 |
| 1147.0 | 0.186 |
| 1146.0 | 0.19 |
| 1145.0 | 0.202 |
| 1144.0 | 0.216 |
| 1143.0 | 0.226 |
| 1142.0 | 0.229 |
| 1141.0 | 0.224 |
| 1140.0 | 0.214 |
| 1139.0 | 0.202 |
| 1138.0 | 0.193 |
| 1137.0 | 0.194 |
| 1136.0 | 0.204 |
| 1135.0 | 0.225 |
| 1134.0 | 0.248 |
| 1133.0 | 0.272 |
| 1132.0 | 0.29 |
| 1131.0 | 0.3 |
| 1130.0 | 0.3 |
| 1129.0 | 0.293 |
| 1128.0 | 0.282 |
| 1127.0 | 0.271 |
| 1126.0 | 0.266 |
| 1125.0 | 0.268 |
| 1124.0 | 0.278 |
| 1123.0 | 0.294 |
| 1122.0 | 0.309 |
| 1121.0 | 0.318 |
| 1120.0 | 0.32 |
| 1119.0 | 0.311 |
| 1118.0 | 0.296 |
| 1117.0 | 0.275 |
| 1116.0 | 0.255 |
| 1115.0 | 0.24 |
| 1114.0 | 0.232 |
| 1113.0 | 0.23 |
| 1112.0 | 0.233 |
| 1111.0 | 0.235 |
| 1110.0 | 0.233 |
| 1109.0 | 0.225 |
| 1108.0 | 0.215 |
| 1107.0 | 0.204 |
| 1106.0 | 0.198 |
| 1105.0 | 0.199 |
| 1104.0 | 0.207 |
| 1103.0 | 0.219 |
| 1102.0 | 0.231 |
| 1101.0 | 0.238 |
| 1100.0 | 0.238 |
| 1099.0 | 0.232 |
| 1098.0 | 0.223 |
| 1097.0 | 0.216 |
| 1096.0 | 0.218 |
| 1095.0 | 0.233 |
| 1094.0 | 0.257 |
| 1093.0 | 0.288 |
| 1092.0 | 0.315 |
| 1091.0 | 0.337 |
| 1090.0 | 0.346 |
| 1089.0 | 0.343 |
| 1088.0 | 0.331 |
| 1087.0 | 0.316 |
| 1086.0 | 0.307 |
| 1085.0 | 0.312 |
| 1084.0 | 0.333 |
| 1083.0 | 0.368 |
| 1082.0 | 0.405 |
| 1081.0 | 0.437 |
| 1080.0 | 0.454 |
| 1079.0 | 0.454 |
| 1078.0 | 0.434 |
| 1077.0 | 0.403 |
| 1076.0 | 0.37 |
| 1075.0 | 0.344 |
| 1074.0 | 0.337 |
| 1073.0 | 0.35 |
| 1072.0 | 0.377 |
| 1071.0 | 0.404 |
| 1070.0 | 0.42 |
| 1069.0 | 0.419 |
| 1068.0 | 0.398 |
| 1067.0 | 0.359 |
| 1066.0 | 0.312 |
| 1065.0 | 0.27 |
| 1064.0 | 0.244 |
| 1063.0 | 0.239 |
| 1062.0 | 0.252 |
| 1061.0 | 0.273 |
| 1060.0 | 0.291 |
| 1059.0 | 0.295 |
| 1058.0 | 0.284 |
| 1057.0 | 0.259 |
| 1056.0 | 0.23 |
| 1055.0 | 0.205 |
| 1054.0 | 0.193 |
| 1053.0 | 0.197 |
| 1052.0 | 0.212 |
| 1051.0 | 0.231 |
| 1050.0 | 0.247 |
| 1049.0 | 0.256 |
| 1048.0 | 0.257 |
| 1047.0 | 0.259 |
| 1046.0 | 0.268 |
| 1045.0 | 0.291 |
| 1044.0 | 0.327 |
| 1043.0 | 0.374 |
| 1042.0 | 0.42 |
| 1041.0 | 0.462 |
| 1040.0 | 0.491 |
| 1039.0 | 0.509 |
| 1038.0 | 0.518 |
| 1037.0 | 0.524 |
| 1036.0 | 0.53 |
| 1035.0 | 0.541 |
| 1034.0 | 0.556 |
| 1033.0 | 0.571 |
| 1032.0 | 0.585 |
| 1031.0 | 0.592 |
| 1030.0 | 0.592 |
| 1029.0 | 0.586 |
| 1028.0 | 0.581 |
| 1027.0 | 0.579 |
| 1026.0 | 0.581 |
| 1025.0 | 0.587 |
| 1024.0 | 0.595 |
| 1023.0 | 0.6 |
| 1022.0 | 0.599 |
| 1021.0 | 0.591 |
| 1020.0 | 0.578 |
| 1019.0 | 0.563 |
| 1018.0 | 0.549 |
| 1017.0 | 0.538 |
| 1016.0 | 0.532 |
| 1015.0 | 0.528 |
| 1014.0 | 0.521 |
| 1013.0 | 0.509 |
| 1012.0 | 0.489 |
| 1011.0 | 0.46 |
| 1010.0 | 0.426 |
| 1009.0 | 0.392 |
| 1008.0 | 0.36 |
| 1007.0 | 0.333 |
| 1006.0 | 0.312 |
| 1005.0 | 0.294 |
| 1004.0 | 0.272 |
| 1003.0 | 0.244 |
| 1002.0 | 0.211 |
| 1001.0 | 0.174 |
| 1000.0 | 0.143 |
| 999.0 | 0.119 |
| 998.0 | 0.104 |
| 997.0 | 0.097 |
| 996.0 | 0.094 |
| 995.0 | 0.092 |
| 994.0 | 0.092 |
| 993.0 | 0.096 |
| 992.0 | 0.106 |
| 991.0 | 0.122 |
| 990.0 | 0.14 |
| 989.0 | 0.158 |
| 988.0 | 0.17 |
| 987.0 | 0.173 |
| 986.0 | 0.17 |
| 985.0 | 0.161 |
| 984.0 | 0.154 |
| 983.0 | 0.149 |
| 982.0 | 0.149 |
| 981.0 | 0.152 |
| 980.0 | 0.155 |
| 979.0 | 0.157 |
| 978.0 | 0.157 |
| 977.0 | 0.154 |
| 976.0 | 0.151 |
| 975.0 | 0.147 |
| 974.0 | 0.144 |
| 973.0 | 0.141 |
| 972.0 | 0.136 |
| 971.0 | 0.13 |
| 970.0 | 0.122 |
| 969.0 | 0.113 |
| 968.0 | 0.105 |
| 967.0 | 0.1 |
| 966.0 | 0.097 |
| 965.0 | 0.096 |
| 964.0 | 0.097 |
| 963.0 | 0.098 |
| 962.0 | 0.101 |
| 961.0 | 0.104 |
| 960.0 | 0.108 |
| 959.0 | 0.112 |
| 958.0 | 0.115 |
| 957.0 | 0.116 |
| 956.0 | 0.117 |
| 955.0 | 0.118 |
| 954.0 | 0.12 |
| 953.0 | 0.123 |
| 952.0 | 0.127 |
| 951.0 | 0.13 |
| 950.0 | 0.13 |
| 949.0 | 0.128 |
| 948.0 | 0.125 |
| 947.0 | 0.122 |
| 946.0 | 0.121 |
| 945.0 | 0.122 |
| 944.0 | 0.123 |
| 943.0 | 0.122 |
| 942.0 | 0.119 |
| 941.0 | 0.113 |
| 940.0 | 0.105 |
| 939.0 | 0.098 |
| 938.0 | 0.092 |
| 937.0 | 0.086 |
| 936.0 | 0.082 |
| 935.0 | 0.076 |
| 934.0 | 0.07 |
| 933.0 | 0.065 |
| 932.0 | 0.061 |
| 931.0 | 0.059 |
| 930.0 | 0.059 |
| 929.0 | 0.06 |
| 928.0 | 0.061 |
| 927.0 | 0.061 |
| 926.0 | 0.061 |
| 925.0 | 0.061 |
| 924.0 | 0.064 |
| 923.0 | 0.068 |
| 922.0 | 0.072 |
| 921.0 | 0.075 |
| 920.0 | 0.075 |
| 919.0 | 0.075 |
| 918.0 | 0.074 |
| 917.0 | 0.076 |
| 916.0 | 0.079 |
| 915.0 | 0.083 |
| 914.0 | 0.085 |
| 913.0 | 0.084 |
| 912.0 | 0.08 |
| 911.0 | 0.074 |
| 910.0 | 0.068 |
| 909.0 | 0.063 |
| 908.0 | 0.058 |
| 907.0 | 0.054 |
| 906.0 | 0.049 |
| 905.0 | 0.045 |
| 904.0 | 0.043 |
| 903.0 | 0.042 |
| 902.0 | 0.042 |
| 901.0 | 0.043 |
| 900.0 | 0.043 |
| 899.0 | 0.043 |
| 898.0 | 0.044 |
| 897.0 | 0.044 |
| 896.0 | 0.044 |
| 895.0 | 0.043 |
| 894.0 | 0.041 |
| 893.0 | 0.039 |
| 892.0 | 0.036 |
| 891.0 | 0.035 |
| 890.0 | 0.034 |
| 889.0 | 0.033 |
| 888.0 | 0.033 |
| 887.0 | 0.033 |
| 886.0 | 0.032 |
| 885.0 | 0.031 |
| 884.0 | 0.031 |
| 883.0 | 0.03 |
| 882.0 | 0.029 |
| 881.0 | 0.029 |
| 880.0 | 0.028 |
| 879.0 | 0.027 |
| 878.0 | 0.026 |
| 877.0 | 0.025 |
| 876.0 | 0.024 |
| 875.0 | 0.023 |
| 874.0 | 0.022 |
| 873.0 | 0.021 |
| 872.0 | 0.02 |
| 871.0 | 0.019 |
| 870.0 | 0.019 |
| 869.0 | 0.018 |
| 868.0 | 0.018 |
| 867.0 | 0.017 |
| 866.0 | 0.017 |
| 865.0 | 0.017 |
| 864.0 | 0.016 |
| 863.0 | 0.016 |
| 862.0 | 0.016 |
| 861.0 | 0.016 |
| 860.0 | 0.014 |
| 859.0 | 0.012 |
| 858.0 | 0.014 |
| 857.0 | 0.017 |
| 856.0 | 0.019 |
| 855.0 | 0.017 |
| 854.0 | 0.013 |
| 853.0 | 0.011 |
| 852.0 | 0.012 |
| 851.0 | 0.014 |
| 850.0 | 0.016 |
| 849.0 | 0.015 |
| 848.0 | 0.011 |
| 847.0 | 0.009 |
| 846.0 | 0.01 |
| 845.0 | 0.012 |
| 844.0 | 0.014 |
| 843.0 | 0.013 |
| 842.0 | 0.01 |
| 841.0 | 0.008 |
| 840.0 | 0.008 |
| 839.0 | 0.011 |
| 838.0 | 0.012 |
| 837.0 | 0.012 |
| 836.0 | 0.011 |
| 835.0 | 0.011 |
| 834.0 | 0.012 |
| 833.0 | 0.013 |
| 832.0 | 0.013 |
| 831.0 | 0.01 |
| 830.0 | 0.008 |
| 829.0 | 0.009 |
| 828.0 | 0.012 |
| 827.0 | 0.015 |
| 826.0 | 0.015 |
| 825.0 | 0.011 |
| 824.0 | 0.008 |
| 823.0 | 0.007 |
| 822.0 | 0.009 |
| 821.0 | 0.011 |
| 820.0 | 0.012 |
| 819.0 | 0.01 |
| 818.0 | 0.006 |
| 817.0 | 0.004 |
| 816.0 | 0.004 |
| 815.0 | 0.004 |
| 814.0 | 0.004 |
| 813.0 | 0.004 |
| 812.0 | 0.004 |
| 811.0 | 0.004 |
| 810.0 | 0.008 |
| 809.0 | 0.01 |
| 808.0 | 0.003 |
| 807.0 | 0.005 |
| 806.0 | 0.007 |
| 805.0 | 0 |
| 804.0 | 0 |
| 803.0 | 0.007 |
| 802.0 | 0.009 |
| 801.0 | 0.003 |
| 800.0 | 0.007 |
| 799.0 | 0.006 |
| 798.0 | 0.008 |
| 797.0 | 0.007 |
| 796.0 | 0.002 |
| 795.0 | 0.007 |
| 794.0 | 0.005 |
| 793.0 | 0.007 |
| 792.0 | 0.003 |
| 791.0 | 0.008 |
| 790.0 | 0.007 |
| 789.0 | 0.008 |
| 788.0 | 0.007 |
| 787.0 | 0.001 |
| 786.0 | 0.008 |
| 785.0 | 0.01 |
| 784.0 | 0.005 |
| 783.0 | 0.004 |
| 782.0 | 0 |
| 781.0 | 0 |
| 780.0 | 0.005 |
| 779.0 | 0.005 |
| 778.0 | 0.001 |
| 777.0 | 0.004 |
| 776.0 | 0 |
| 775.0 | 0.004 |
| 774.0 | 0.011 |
| 773.0 | 0.003 |
| 772.0 | 0.003 |
| 771.0 | 0.004 |
| 770.0 | 0 |
| 769.0 | 0.005 |
| 768.0 | 0.014 |
| 767.0 | 0.007 |
| 766.0 | 0.006 |
| 765.0 | 0.002 |
| 764.0 | 0 |
| 763.0 | 0.006 |
| 762.0 | 0.011 |
| 761.0 | 0.01 |
| 760.0 | 0.009 |
| 759.0 | 0.006 |
| 758.0 | 0.003 |
| 757.0 | 0.001 |
| 756.0 | 0.006 |
| 755.0 | 0.003 |
| 754.0 | 0.004 |
| 753.0 | 0.006 |
| 752.0 | 0.005 |
| 751.0 | 0.006 |
| 750.0 | 0.004 |
| 749.0 | 0.005 |
| 748.0 | 0.001 |
| 747.0 | 0.006 |
| 746.0 | 0.003 |
| 745.0 | 0.003 |
| 744.0 | 0.007 |
| 743.0 | 0.006 |
| 742.0 | 0.005 |
| 741.0 | 0.01 |
| 740.0 | 0.007 |
| 739.0 | 0.008 |
| 738.0 | 0.007 |
| 737.0 | 0.001 |
| 736.0 | 0.007 |
| 735.0 | 0.008 |
| 734.0 | 0.004 |
| 733.0 | 0.005 |
| 732.0 | 0.007 |
| 731.0 | 0.003 |
| 730.0 | 0.005 |
| 729.0 | 0.005 |
| 728.0 | 0.002 |
| 727.0 | 0.002 |
| 726.0 | 0.002 |
| 725.0 | 0.002 |
| 724.0 | 0.008 |
| 723.0 | 0.006 |
| 722.0 | 0.003 |
| 721.0 | 0.004 |
| 720.0 | 0.005 |
| 719.0 | 0.004 |
| 718.0 | 0.004 |
| 717.0 | 0.004 |
| 716.0 | 0.003 |
| 715.0 | 0.009 |
| 714.0 | 0.006 |
| 713.0 | 0.001 |
| 712.0 | 0.002 |
| 711.0 | 0.003 |
| 710.0 | 0.002 |
| 709.0 | 0.006 |
| 708.0 | 0.003 |
| 707.0 | 0.004 |
| 706.0 | 0.007 |
| 705.0 | 0.006 |
| 704.0 | 0.002 |
| 703.0 | 0.005 |
| 702.0 | 0.007 |
| 701.0 | 0.005 |
| 700.0 | 0.006 |
| 699.0 | 0.006 |
| 698.0 | 0.007 |
| 697.0 | 0.006 |
| 696.0 | 0.004 |
| 695.0 | 0.002 |
| 694.0 | 0.003 |
| 693.0 | 0.004 |
| 692.0 | 0.001 |
| 691.0 | 0.003 |
| 690.0 | 0.002 |
| 689.0 | 0.004 |
| 688.0 | 0.004 |
| 687.0 | 0.002 |
| 686.0 | 0.005 |
| 685.0 | 0.006 |
| 684.0 | 0.007 |
| 683.0 | 0.005 |
| 682.0 | 0.005 |
| 681.0 | 0.004 |
| 680.0 | 0.006 |
| 679.0 | 0.003 |
| 678.0 | 0.002 |
| 677.0 | 0.004 |
| 676.0 | 0.005 |
| 675.0 | 0.002 |
| 674.0 | 0.003 |
| 673.0 | 0.005 |
| 672.0 | 0.005 |
| 671.0 | 0.004 |
| 670.0 | 0.004 |
| 669.0 | 0.004 |
| 668.0 | 0.004 |
| 667.0 | 0.005 |
| 666.0 | 0.005 |
| 665.0 | 0.003 |
| 664.0 | 0.003 |
| 663.0 | 0.004 |
| 662.0 | 0.007 |
| 661.0 | 0.005 |
| 660.0 | 0.004 |
| 659.0 | 0.004 |
| 658.0 | 0.005 |
| 657.0 | 0.005 |
| 656.0 | 0.005 |
| 655.0 | 0.006 |
| 654.0 | 0.006 |
| 653.0 | 0.004 |
| 652.0 | 0.002 |
| 651.0 | 0.002 |
| 650.0 | 0.005 |
| 649.0 | 0.005 |
| 648.0 | 0.003 |
| 647.0 | 0.004 |
| 646.0 | 0.005 |
| 645.0 | 0.005 |
| 644.0 | 0.004 |
| 643.0 | 0.004 |
| 642.0 | 0.005 |
| 641.0 | 0.005 |
| 640.0 | 0.005 |
| 639.0 | 0.004 |
| 638.0 | 0.006 |
| 637.0 | 0.008 |
| 636.0 | 0.005 |
| 635.0 | 0.005 |
| 634.0 | 0.007 |
| 633.0 | 0.007 |
| 632.0 | 0.005 |
| 631.0 | 0.007 |
| 630.0 | 0.009 |
| 629.0 | 0.008 |
| 628.0 | 0.006 |
| 627.0 | 0.008 |
| 626.0 | 0.011 |
| 625.0 | 0.008 |
| 624.0 | 0.005 |
| 623.0 | 0.007 |
| 622.0 | 0.007 |
| 621.0 | 0.008 |
| 620.0 | 0.01 |
| 619.0 | 0.011 |
| 618.0 | 0.012 |
| 617.0 | 0.009 |
| 616.0 | 0.01 |
| 615.0 | 0.011 |
| 614.0 | 0.01 |
| 613.0 | 0.013 |
| 612.0 | 0.011 |
| 611.0 | 0.009 |
| 610.0 | 0.013 |
| 609.0 | 0.012 |
| 608.0 | 0.009 |
| 607.0 | 0.012 |
| 606.0 | 0.014 |
| 605.0 | 0.023 |
| 604.0 | 0.029 |
| 603.0 | 0.286 |
| 602.0 | 0.477 |
| 601.0 | 0.86 |
| 600.0 | 3.956 |
| 599.0 | 5.1 |
| 598.0 | 5.623 |
| 597.0 | 5.721 |
| 596.0 | 6.456 |
| 595.0 | 7.097 |
| 594.0 | 6.017 |
| 593.0 | 5.726 |
| 592.0 | 5.551 |
| 591.0 | 5.496 |
| 590.0 | 5.593 |
| 589.0 | 5.772 |
| 588.0 | 5.597 |
| 587.0 | 4.51 |
| 586.0 | 3.368 |
| 585.0 | 1.902 |
| 584.0 | 0.599 |
| 583.0 | 0.155 |
| 582.0 | 0.03 |
| 581.0 | 0.017 |
| 580.0 | 0.015 |
| 579.0 | 0.017 |
| 578.0 | 0.012 |
| 577.0 | 0.01 |
| 576.0 | 0.01 |
| 575.0 | 0.014 |
| 574.0 | 0.014 |
| 573.0 | 0.011 |
| 572.0 | 0.009 |
| 571.0 | 0.009 |
| 570.0 | 0.009 |
| 569.0 | 0.014 |
| 568.0 | 0.015 |
| 567.0 | 0.009 |
| 566.0 | 0.013 |
| 565.0 | 0.011 |
| 564.0 | 0.008 |
| 563.0 | 0.011 |
| 562.0 | 0.013 |
| 561.0 | 0.009 |
| 560.0 | 0.01 |
| 559.0 | 0.014 |
| 558.0 | 0.011 |
| 557.0 | 0.01 |
| 556.0 | 0.014 |
| 555.0 | 0.015 |
| 554.0 | 0.012 |
| 553.0 | 0.01 |
| 552.0 | 0.011 |
| 551.0 | 0.01 |
| 550.0 | 0.008 |
| 549.0 | 0.008 |
| 548.0 | 0.009 |
| 547.0 | 0.012 |
| 546.0 | 0.012 |
| 545.0 | 0.012 |
| 544.0 | 0.012 |
| 543.0 | 0.008 |
| 542.0 | 0.01 |
| 541.0 | 0.009 |
| 540.0 | 0.01 |
| 539.0 | 0.009 |
| 538.0 | 0.014 |
| 537.0 | 0.011 |
| 536.0 | 0.016 |
| 535.0 | 0.016 |
| 534.0 | 0.016 |
| 533.0 | 0.012 |
| 532.0 | 0.01 |
| 531.0 | 0.009 |
| 530.0 | 0.013 |
| 529.0 | 0.01 |
| 528.0 | 0.011 |
| 527.0 | 0.013 |
| 526.0 | 0.013 |
| 525.0 | 0.011 |
| 524.0 | 0.014 |
| 523.0 | 0.011 |
| 522.0 | 0.011 |
| 521.0 | 0.012 |
| 520.0 | 0.011 |
| 519.0 | 0.011 |
| 518.0 | 0.014 |
| 517.0 | 0.011 |
| 516.0 | 0.013 |
| 515.0 | 0.012 |
| 514.0 | 0.011 |
| 513.0 | 0.013 |
| 512.0 | 0.013 |
| 511.0 | 0.013 |
| 510.0 | 0.011 |
| 509.0 | 0.013 |
| 508.0 | 0.014 |
| 507.0 | 0.01 |
| 506.0 | 0.012 |
| 505.0 | 0.009 |
| 504.0 | 0.009 |
| 503.0 | 0.01 |
| 502.0 | 0.013 |
| 501.0 | 0.01 |
| 500.0 | 0.012 |
| 499.0 | 0.012 |
| 498.0 | 0.012 |
| 497.0 | 0.014 |
| 496.0 | 0.013 |
| 495.0 | 0.014 |
| 494.0 | 0.016 |
| 493.0 | 0.011 |
| 492.0 | 0.015 |
| 491.0 | 0.014 |
| 490.0 | 0.012 |
| 489.0 | 0.01 |
| 488.0 | 0.016 |
| 487.0 | 0.015 |
| 486.0 | 0.016 |
| 485.0 | 0.014 |
| 484.0 | 0.014 |
| 483.0 | 0.011 |
| 482.0 | 0.014 |
| 481.0 | 0.015 |
| 480.0 | 0.015 |
| 479.0 | 0.014 |
| 478.0 | 0.011 |
| 477.0 | 0.015 |
| 476.0 | 0.016 |
| 475.0 | 0.013 |
| 474.0 | 0.016 |
| 473.0 | 0.014 |
| 472.0 | 0.013 |
| 471.0 | 0.018 |
| 470.0 | 0.018 |
| 469.0 | 0.013 |
| 468.0 | 0.012 |
| 467.0 | 0.014 |
| 466.0 | 0.014 |
| 465.0 | 0.016 |
| 464.0 | 0.021 |
| 463.0 | 0.017 |
| 462.0 | 0.019 |
| 461.0 | 0.015 |
| 460.0 | 0.016 |
| 459.0 | 0.017 |
| 458.0 | 0.019 |
| 457.0 | 0.019 |
| 456.0 | 0.015 |
| 455.0 | 0.016 |
| 454.0 | 0.02 |
| 453.0 | 0.019 |
| 452.0 | 0.019 |
| 451.0 | 0.018 |
| 450.0 | 0.019 |
| 449.0 | 0.018 |
| 448.0 | 0.019 |
| 447.0 | 0.017 |
| 446.0 | 0.02 |
| 445.0 | 0.019 |
| 444.0 | 0.02 |
| 443.0 | 0.021 |
| 442.0 | 0.023 |
| 441.0 | 0.028 |
| 440.0 | 0.026 |
| 439.0 | 0.02 |
| 438.0 | 0.02 |
| 437.0 | 0.021 |
| 436.0 | 0.021 |
| 435.0 | 0.023 |
| 434.0 | 0.024 |
| 433.0 | 0.024 |
| 432.0 | 0.026 |
| 431.0 | 0.027 |
| 430.0 | 0.028 |
| 429.0 | 0.029 |
| 428.0 | 0.03 |
| 427.0 | 0.032 |
| 426.0 | 0.034 |
| 425.0 | 0.035 |
| 424.0 | 0.037 |
| 423.0 | 0.04 |
| 422.0 | 0.041 |
| 421.0 | 0.043 |
| 420.0 | 0.046 |
| 419.0 | 0.052 |
| 418.0 | 0.06 |
| 417.0 | 0.074 |
| 416.0 | 0.14 |
| 415.0 | 0.338 |
| 414.0 | 0.746 |
| 413.0 | 1.462 |
| 412.0 | 2.657 |
| 411.0 | 3.559 |
| 410.0 | 4.067 |
| 409.0 | 4.802 |
| 408.0 | 4.501 |
| 407.0 | 4.906 |
| 406.0 | 4.906 |
| 405.0 | 4.429 |
| 404.0 | 4.743 |
| 403.0 | 4.567 |
| 402.0 | 4.39 |
| 401.0 | 4.691 |
| 400.0 | 5.646 |
| 399.0 | 4.428 |
| 398.0 | 4.274 |
| 397.0 | 4.302 |
| 396.0 | 4.273 |
| 395.0 | 4.238 |
| 394.0 | 4.666 |
| 393.0 | 4.365 |
| 392.0 | 4.714 |
| 391.0 | 4.513 |
| 390.0 | 4.321 |
| 389.0 | 4.74 |
| 388.0 | 4.74 |
| 387.0 | 4.412 |
| 386.0 | 4.739 |
| 385.0 | 4.902 |
| 384.0 | 4.412 |
| 383.0 | 4.713 |
| 382.0 | 5.244 |
| 381.0 | 4.437 |
| 380.0 | 4.863 |
| 379.0 | 4.796 |
| 378.0 | 4.422 |
| 377.0 | 4.307 |
| 376.0 | 4.449 |
| 375.0 | 4.736 |
| 374.0 | 4.493 |
| 373.0 | 4.826 |
| 372.0 | 5.638 |
| 371.0 | 4.408 |
| 370.0 | 4.395 |
| 369.0 | 4.407 |
| 368.0 | 4.42 |
| 367.0 | 4.792 |
| 366.0 | 5.939 |
| 365.0 | 4.358 |
| 364.0 | 4.304 |
| 363.0 | 4.256 |
| 362.0 | 4.419 |
| 361.0 | 4.658 |
| 360.0 | 4.983 |
| 359.0 | 4.335 |
| 358.0 | 4.237 |
| 357.0 | 4.574 |
| 356.0 | 4.38 |
| 355.0 | 4.657 |
| 354.0 | 4.68 |
| 353.0 | 4.245 |
| 352.0 | 4.292 |
| 351.0 | 4.367 |
| 350.0 | 4.291 |
| 349.0 | 4.656 |
| 348.0 | 4.893 |
| 347.0 | 4.503 |
| 346.0 | 4.226 |
| 345.0 | 4.632 |
| 344.0 | 4.331 |
| 343.0 | 4.535 |
| 342.0 | 4.654 |
| 341.0 | 4.353 |
| 340.0 | 4.208 |
| 339.0 | 4.891 |
| 338.0 | 4.233 |
| 337.0 | 4.891 |
| 336.0 | 4.677 |
| 335.0 | 4.341 |
| 334.0 | 4.125 |
| 333.0 | 4.329 |
| 332.0 | 4.153 |
| 331.0 | 4.785 |
| 330.0 | 4.675 |
| 329.0 | 4.569 |
| 328.0 | 4.287 |
| 327.0 | 4.453 |
| 326.0 | 4.248 |
| 325.0 | 5.151 |
| 324.0 | 4.783 |
| 323.0 | 4.266 |
| 322.0 | 4.136 |
| 321.0 | 4.295 |
| 320.0 | 4.173 |
| 319.0 | 5.025 |
| 318.0 | 4.434 |
| 317.0 | 4.226 |
| 316.0 | 4.262 |
| 315.0 | 4.51 |
| 314.0 | 4.356 |
| 313.0 | 4.845 |
| 312.0 | 5.623 |
| 311.0 | 4.356 |
| 310.0 | 4.379 |
| 309.0 | 4.508 |
| 308.0 | 4.392 |
| 307.0 | 4.777 |
| 306.0 | 5.02 |
| 305.0 | 4.215 |
| 304.0 | 4.278 |
| 303.0 | 4.309 |
| 302.0 | 4.403 |
| 301.0 | 4.967 |
| 300.0 | 5.222 |
| 299.0 | 4.352 |
| 298.0 | 4.213 |
| 297.0 | 4.665 |
| 296.0 | 4.267 |
| 295.0 | 4.878 |
| 294.0 | 4.743 |
| 293.0 | 4.388 |
| 292.0 | 4.194 |
| 291.0 | 5.219 |
| 290.0 | 4.35 |
| 289.0 | 5.14 |
| 288.0 | 4.662 |
| 287.0 | 4.373 |
| 286.0 | 4.111 |
| 285.0 | 4.837 |
| 284.0 | 4.273 |
| 283.0 | 5.314 |
| 282.0 | 4.916 |
| 281.0 | 4.314 |
| 280.0 | 4.183 |
| 279.0 | 4.424 |
| 278.0 | 4.123 |
| 277.0 | 5.216 |
| 276.0 | 4.499 |
| 275.0 | 4.346 |
| 274.0 | 4.15 |
| 273.0 | 5.069 |
| 272.0 | 4.215 |
| 271.0 | 4.872 |
| 270.0 | 4.683 |
| 269.0 | 4.29 |
| 268.0 | 4.181 |
| 267.0 | 4.658 |
| 266.0 | 4.515 |
| 265.0 | 4.612 |
| 264.0 | 4.59 |
| 263.0 | 4.142 |
| 262.0 | 4.172 |
| 261.0 | 4.368 |
| 260.0 | 4.24 |
| 259.0 | 5.434 |
| 258.0 | 4.589 |
| 257.0 | 4.23 |
| 256.0 | 4.211 |
| 255.0 | 4.495 |
| 254.0 | 4.257 |
| 253.0 | 4.795 |
| 252.0 | 4.795 |
| 251.0 | 4.089 |
| 250.0 | 4.275 |
| 249.0 | 4.328 |
| 248.0 | 4.305 |
| 247.0 | 4.953 |
| 246.0 | 4.828 |
| 245.0 | 4.114 |
| 244.0 | 5.429 |
| 243.0 | 4.174 |
| 242.0 | 4.475 |
| 241.0 | 4.263 |
| 240.0 | 4.191 |
| 239.0 | 4.128 |
| 238.0 | 4.225 |
| 237.0 | 4.121 |
| 236.0 | 4.952 |
| 235.0 | 4.585 |
| 234.0 | 4.217 |
| 233.0 | 4.055 |
| 232.0 | 4.158 |
| 231.0 | 4.387 |
| 230.0 | 4.262 |
| 229.0 | 4.189 |
| 228.0 | 4.427 |
| 227.0 | 4.214 |
| 226.0 | 4.727 |
| 225.0 | 4.139 |
| 224.0 | 4.229 |
| 223.0 | 4.369 |
| 222.0 | 4.724 |
| 221.0 | 4.018 |
| 220.0 | 4.33 |
| 219.0 | 4.254 |
| 218.0 | 4.449 |
| 217.0 | 4.749 |
| 216.0 | 4.552 |
| 215.0 | 4.17 |
| 214.0 | 4.212 |
| 213.0 | 4.43 |
| 212.0 | 4.159 |
| 211.0 | 4.51 |
| 210.0 | 4.443 |
| 209.0 | 4.133 |
| 208.0 | 4.216 |
| 207.0 | 4.264 |
| 206.0 | 4.146 |
| 205.0 | 4.423 |
| 204.0 | 4.222 |
| 203.0 | 4.065 |
| 202.0 | 4.044 |
| 201.0 | 4.076 |
| 200.0 | 3.99 |